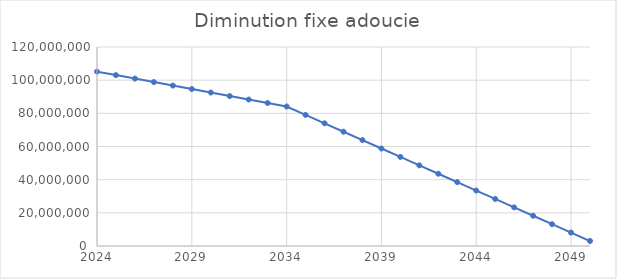
| Category | Emissions (t eqCO2) |
|---|---|
| 2024.0 | 105153500 |
| 2025.0 | 103050430 |
| 2026.0 | 100947360 |
| 2027.0 | 98844290 |
| 2028.0 | 96741220 |
| 2029.0 | 94638150 |
| 2030.0 | 92535080 |
| 2031.0 | 90432010 |
| 2032.0 | 88328940 |
| 2033.0 | 86225870 |
| 2034.0 | 84122800 |
| 2035.0 | 79054250 |
| 2036.0 | 73985700 |
| 2037.0 | 68917150 |
| 2038.0 | 63848600 |
| 2039.0 | 58780050 |
| 2040.0 | 53711500 |
| 2041.0 | 48642950 |
| 2042.0 | 43574400 |
| 2043.0 | 38505850 |
| 2044.0 | 33437300 |
| 2045.0 | 28368750 |
| 2046.0 | 23300200 |
| 2047.0 | 18231650 |
| 2048.0 | 13163100 |
| 2049.0 | 8094550 |
| 2050.0 | 3026000 |